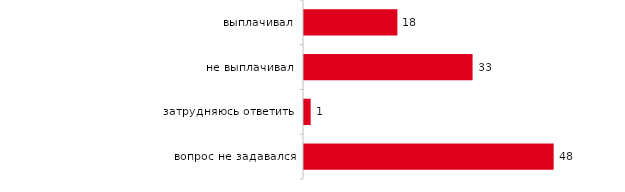
| Category | Series 0 |
|---|---|
| выплачивал | 18.02 |
| не выплачивал | 32.525 |
| затрудняюсь ответить | 1.287 |
| вопрос не задавался | 48.168 |